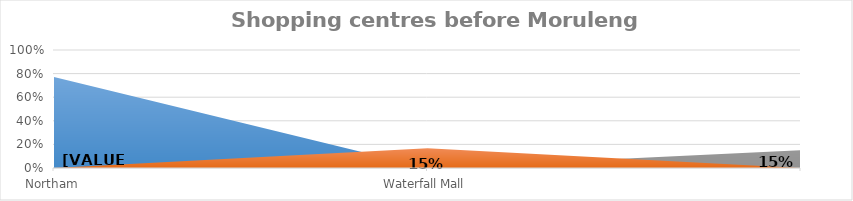
| Category | Mogwase | Waterfall Mall |
|---|---|---|
| Northam | 0.77 | 0 |
| Waterfall Mall | 0 | 0 |